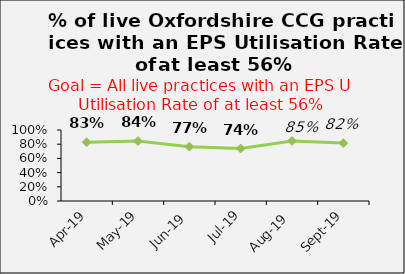
| Category | Bucks CCGs |
|---|---|
| 2019-04-01 | 0.828 |
| 2019-05-01 | 0.844 |
| 2019-06-01 | 0.766 |
| 2019-07-01 | 0.738 |
| 2019-08-01 | 0.846 |
| 2019-09-01 | 0.815 |